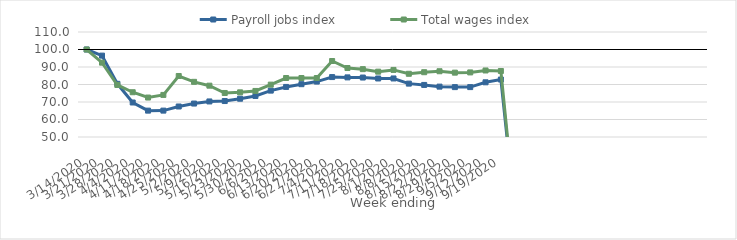
| Category | Payroll jobs index | Total wages index |
|---|---|---|
| 14/03/2020 | 100 | 100 |
| 21/03/2020 | 96.506 | 92.476 |
| 28/03/2020 | 80.388 | 79.728 |
| 04/04/2020 | 69.717 | 75.582 |
| 11/04/2020 | 65.069 | 72.549 |
| 18/04/2020 | 65.08 | 74.05 |
| 25/04/2020 | 67.435 | 84.865 |
| 02/05/2020 | 69.112 | 81.518 |
| 09/05/2020 | 70.314 | 79.331 |
| 16/05/2020 | 70.553 | 75.153 |
| 23/05/2020 | 71.872 | 75.517 |
| 30/05/2020 | 73.453 | 76.317 |
| 06/06/2020 | 76.506 | 79.92 |
| 13/06/2020 | 78.614 | 83.709 |
| 20/06/2020 | 80.181 | 83.71 |
| 27/06/2020 | 81.672 | 83.709 |
| 04/07/2020 | 84.245 | 93.425 |
| 11/07/2020 | 84.068 | 89.413 |
| 18/07/2020 | 83.979 | 88.77 |
| 25/07/2020 | 83.44 | 87.332 |
| 01/08/2020 | 83.454 | 88.335 |
| 08/08/2020 | 80.502 | 86.122 |
| 15/08/2020 | 79.751 | 87.024 |
| 22/08/2020 | 78.778 | 87.576 |
| 29/08/2020 | 78.507 | 86.768 |
| 05/09/2020 | 78.516 | 86.902 |
| 12/09/2020 | 81.251 | 88.015 |
| 19/09/2020 | 82.846 | 87.728 |